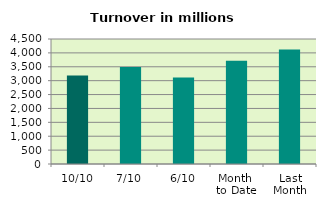
| Category | Series 0 |
|---|---|
| 10/10 | 3184.351 |
| 7/10 | 3492.063 |
| 6/10 | 3117.662 |
| Month 
to Date | 3713.43 |
| Last
Month | 4119.728 |